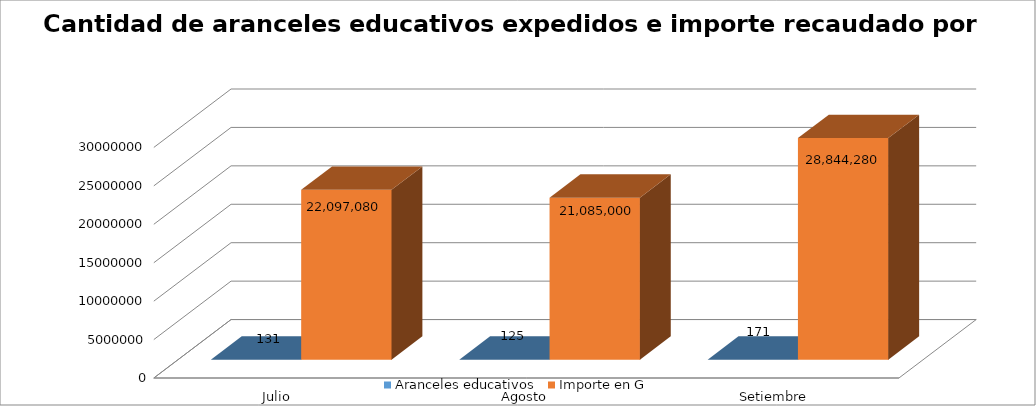
| Category | Aranceles educativos | Importe en G |
|---|---|---|
| Julio | 131 | 22097080 |
| Agosto | 125 | 21085000 |
| Setiembre | 171 | 28844280 |